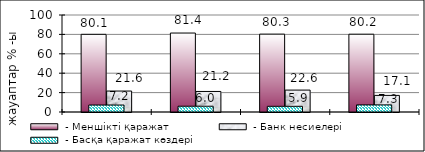
| Category |  - Меншікті қаражат |  - Банк несиелері |
|---|---|---|
| 0 | 80.06 | 21.61 |
| 1 | 81.41 | 21.18 |
| 2 | 80.27 | 22.59 |
| 3 | 80.2 | 17.12 |